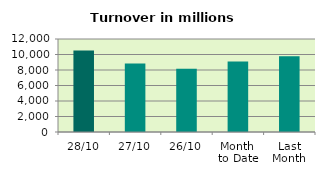
| Category | Series 0 |
|---|---|
| 28/10 | 10523.233 |
| 27/10 | 8828.509 |
| 26/10 | 8170.231 |
| Month 
to Date | 9081.004 |
| Last
Month | 9769.37 |